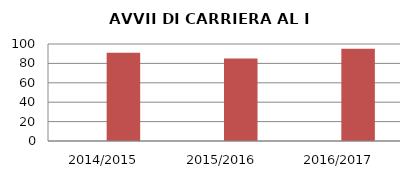
| Category | ANNO | NUMERO |
|---|---|---|
| 2014/2015 | 0 | 91 |
| 2015/2016 | 0 | 85 |
| 2016/2017 | 0 | 95 |